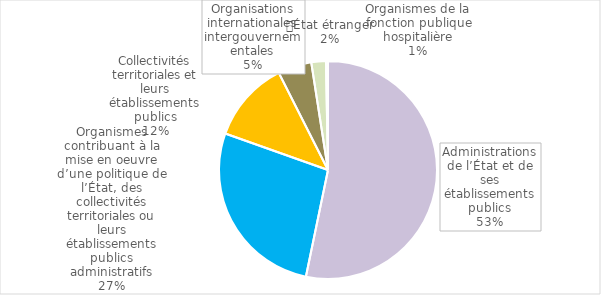
| Category | mise à disposition |
|---|---|
| Administrations de l’État et de ses établissements publics | 0.533 |
| Organismes contribuant à la mise en oeuvre d’une politique de l’État, des collectivités territoriales ou leurs établissements publics administratifs | 0.272 |
| Collectivités territoriales et leurs établissements publics | 0.121 |
| Organisations internationales intergouvernementales | 0.05 |
| État étranger | 0.022 |
| Organismes de la fonction publique hospitalière | 0.003 |